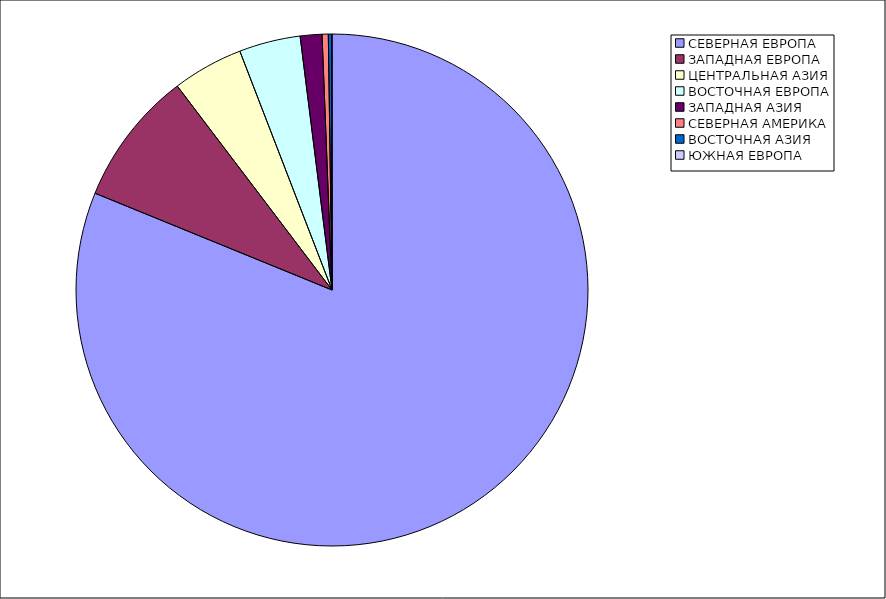
| Category | Оборот |
|---|---|
| СЕВЕРНАЯ ЕВРОПА | 81.17 |
| ЗАПАДНАЯ ЕВРОПА | 8.5 |
| ЦЕНТРАЛЬНАЯ АЗИЯ | 4.47 |
| ВОСТОЧНАЯ ЕВРОПА | 3.87 |
| ЗАПАДНАЯ АЗИЯ | 1.37 |
| СЕВЕРНАЯ АМЕРИКА | 0.39 |
| ВОСТОЧНАЯ АЗИЯ | 0.21 |
| ЮЖНАЯ ЕВРОПА | 0.02 |